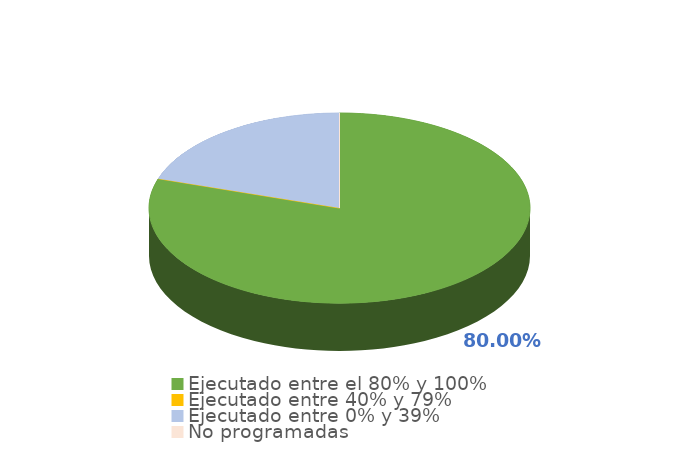
| Category | Series 0 |
|---|---|
| Ejecutado entre el 80% y 100% | 0.8 |
| Ejecutado entre 40% y 79% | 0 |
| Ejecutado entre 0% y 39% | 0.2 |
| No programadas | 0 |